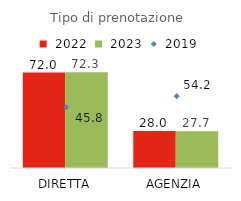
| Category | Series 1 | Series 2 |
|---|---|---|
| DIRETTA | 72 | 72.3 |
| AGENZIA | 28 | 27.7 |